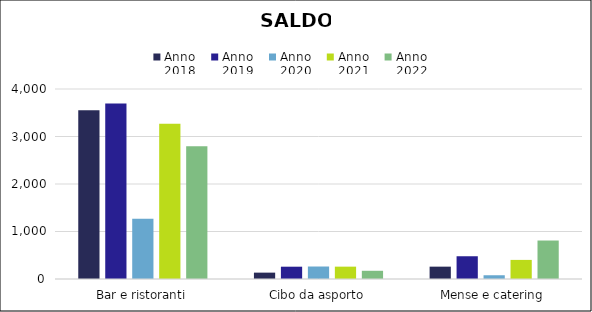
| Category | Anno
2018 | Anno
2019 | Anno
2020 | Anno
2021 | Anno
2022 |
|---|---|---|---|---|---|
| Bar e ristoranti | 3553 | 3696 | 1270 | 3271 | 2796 |
| Cibo da asporto | 134 | 259 | 263 | 260 | 173 |
| Mense e catering | 260 | 479 | 79 | 402 | 810 |